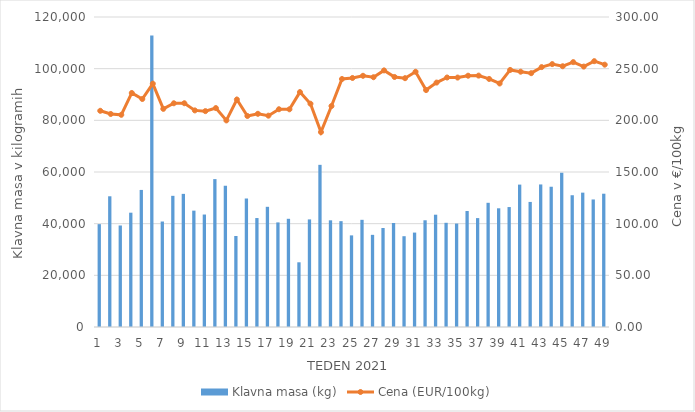
| Category | Klavna masa (kg) |
|---|---|
| 1.0 | 39814 |
| 2.0 | 50603 |
| 3.0 | 39295 |
| 4.0 | 44250 |
| 5.0 | 53061 |
| 6.0 | 112816 |
| 7.0 | 40829 |
| 8.0 | 50775 |
| 9.0 | 51535 |
| 10.0 | 45040 |
| 11.0 | 43536 |
| 12.0 | 57246 |
| 13.0 | 54680 |
| 14.0 | 35237 |
| 15.0 | 49721 |
| 16.0 | 42177 |
| 17.0 | 46525 |
| 18.0 | 40491 |
| 19.0 | 41888 |
| 20.0 | 25048 |
| 21.0 | 41651 |
| 22.0 | 62774 |
| 23.0 | 41297 |
| 24.0 | 40971 |
| 25.0 | 35465 |
| 26.0 | 41489 |
| 27.0 | 35675 |
| 28.0 | 38316 |
| 29.0 | 40265 |
| 30.0 | 35146 |
| 31.0 | 36548 |
| 32.0 | 41314 |
| 33.0 | 43471 |
| 34.0 | 40333 |
| 35.0 | 40041 |
| 36.0 | 44895 |
| 37.0 | 42158 |
| 38.0 | 48077 |
| 39.0 | 45950 |
| 40.0 | 46433 |
| 41.0 | 55121 |
| 42.0 | 48414 |
| 43.0 | 55179 |
| 44.0 | 54294 |
| 45.0 | 59707 |
| 46.0 | 51007 |
| 47.0 | 52010 |
| 48.0 | 49369 |
| 49.0 | 51594 |